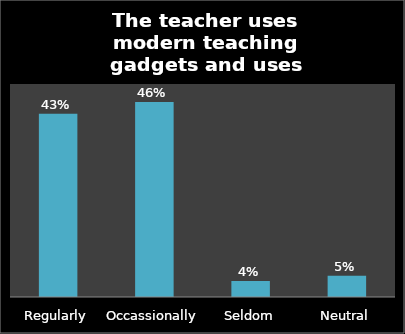
| Category | Series 0 |
|---|---|
| Regularly | 0.43 |
| Occassionally | 0.458 |
| Seldom | 0.038 |
| Neutral | 0.05 |